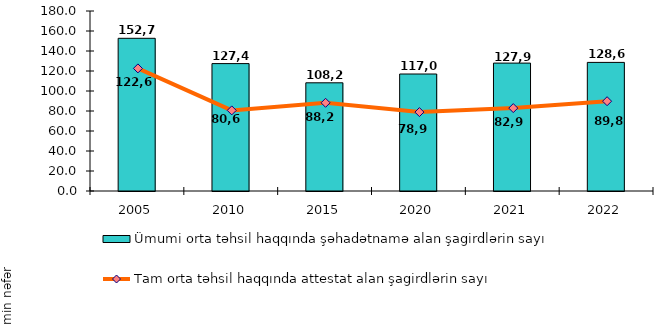
| Category | Ümumi orta təhsil haqqında şəhadətnamə alan şagirdlərin sayı   |
|---|---|
| 2005.0 | 152.7 |
| 2010.0 | 127.4 |
| 2015.0 | 108.2 |
| 2020.0 | 117 |
| 2021.0 | 127.9 |
| 2022.0 | 128.6 |